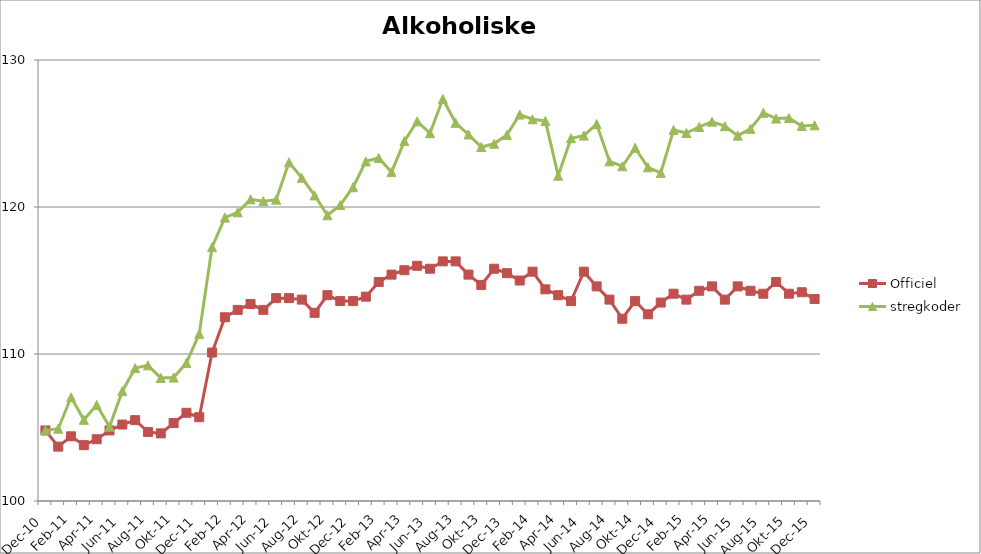
| Category | Officiel | stregkoder |
|---|---|---|
|  Dec-10 | 104.8 | 104.805 |
|  Jan-11 | 103.7 | 104.917 |
|  Feb-11 | 104.4 | 107.054 |
|  Mar-11 | 103.8 | 105.523 |
|  Apr-11 | 104.2 | 106.534 |
|  Maj-11 | 104.8 | 105.059 |
|  Jun-11 | 105.2 | 107.472 |
|  Jul-11 | 105.5 | 109.04 |
|  Aug-11 | 104.7 | 109.227 |
|  Sep-11 | 104.6 | 108.373 |
|  Okt-11 | 105.3 | 108.398 |
|  Nov-11 | 106 | 109.395 |
|  Dec-11 | 105.7 | 111.372 |
|  Jan-12 | 110.1 | 117.271 |
|  Feb-12 | 112.5 | 119.279 |
|  Mar-12 | 113 | 119.64 |
|  Apr-12 | 113.4 | 120.521 |
|  Maj-12 | 113 | 120.399 |
|  Jun-12 | 113.8 | 120.501 |
|  Jul-12 | 113.8 | 123.036 |
|  Aug-12 | 113.7 | 121.987 |
|  Sep-12 | 112.8 | 120.788 |
|  Okt-12 | 114 | 119.437 |
|  Nov-12 | 113.6 | 120.131 |
|  Dec-12 | 113.6 | 121.344 |
|  Jan-13 | 113.9 | 123.103 |
|  Feb-13 | 114.9 | 123.331 |
|  Mar-13 | 115.4 | 122.373 |
|  Apr-13 | 115.7 | 124.482 |
|  Maj-13 | 116 | 125.829 |
|  Jun-13 | 115.8 | 125.019 |
|  Jul-13 | 116.3 | 127.349 |
|  Aug-13 | 116.3 | 125.726 |
|  Sep-13 | 115.4 | 124.934 |
|  Okt-13 | 114.7 | 124.083 |
|  Nov-13 | 115.8 | 124.302 |
|  Dec-13 | 115.5 | 124.907 |
|  Jan-14 | 115 | 126.288 |
|  Feb-14 | 115.6 | 125.968 |
|  Mar-14 | 114.4 | 125.855 |
|  Apr-14 | 114 | 122.13 |
|  Maj-14 | 113.6 | 124.678 |
|  Jun-14 | 115.6 | 124.857 |
|  Jul-14 | 114.6 | 125.644 |
|  Aug-14 | 113.7 | 123.104 |
|  Sep-14 | 112.4 | 122.771 |
|  Okt-14 | 113.6 | 124.026 |
|  Nov-14 | 112.7 | 122.702 |
|  Dec-14 | 113.5 | 122.319 |
|  Jan-15 | 114.1 | 125.24 |
|  Feb-15 | 113.7 | 125.034 |
|  Mar-15 | 114.3 | 125.443 |
|  Apr-15 | 114.6 | 125.8 |
|  Maj-15 | 113.7 | 125.498 |
| Jun-15 | 114.6 | 124.854 |
| Jul-15 | 114.3 | 125.315 |
| Aug-15 | 114.1 | 126.409 |
| Sep-15 | 114.9 | 126.018 |
| Okt-15 | 114.1 | 126.051 |
| Nov-15 | 114.2 | 125.516 |
| Dec-15 | 113.745 | 125.557 |